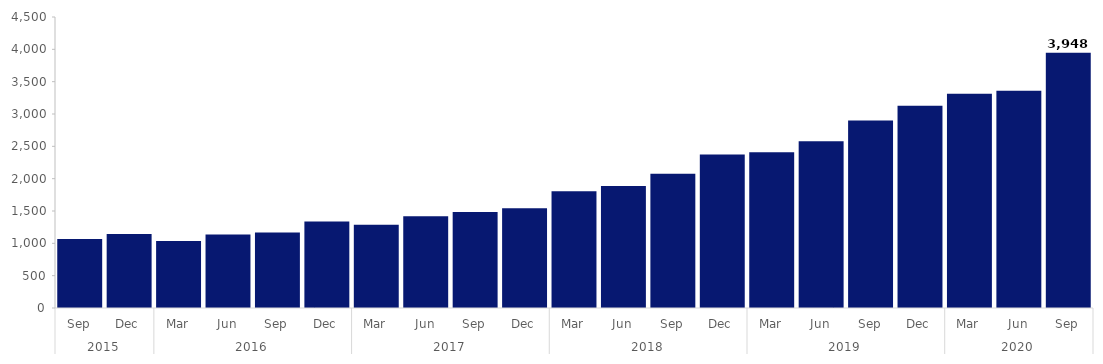
| Category | Series 0 |
|---|---|
| 0 | 1068 |
| 1 | 1143 |
| 2 | 1036 |
| 3 | 1135 |
| 4 | 1168 |
| 5 | 1339 |
| 6 | 1289 |
| 7 | 1420 |
| 8 | 1483 |
| 9 | 1543 |
| 10 | 1805 |
| 11 | 1885 |
| 12 | 2076 |
| 13 | 2374 |
| 14 | 2407 |
| 15 | 2580 |
| 16 | 2901 |
| 17 | 3126 |
| 18 | 3312 |
| 19 | 3359 |
| 20 | 3948 |